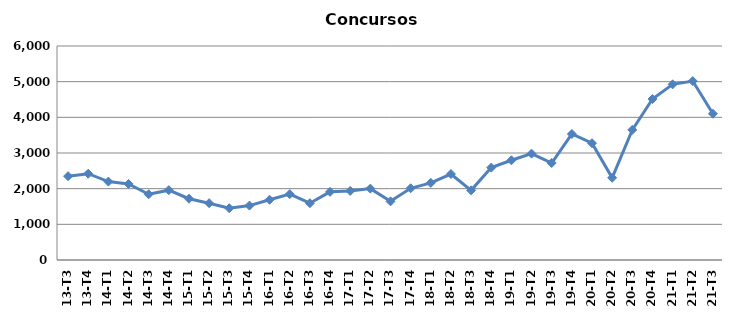
| Category | Concursos |
|---|---|
| 13-T3 | 2350 |
| 13-T4 | 2419 |
| 14-T1 | 2198 |
| 14-T2 | 2133 |
| 14-T3 | 1843 |
| 14-T4 | 1958 |
| 15-T1 | 1718 |
| 15-T2 | 1593 |
| 15-T3 | 1451 |
| 15-T4 | 1526 |
| 16-T1 | 1689 |
| 16-T2 | 1847 |
| 16-T3 | 1593 |
| 16-T4 | 1911 |
| 17-T1 | 1937 |
| 17-T2 | 2001 |
| 17-T3 | 1645 |
| 17-T4 | 2011 |
| 18-T1 | 2162 |
| 18-T2 | 2410 |
| 18-T3 | 1953 |
| 18-T4 | 2590 |
| 19-T1 | 2796 |
| 19-T2 | 2982 |
| 19-T3 | 2719 |
| 19-T4 | 3534 |
| 20-T1 | 3274 |
| 20-T2 | 2305 |
| 20-T3 | 3649 |
| 20-T4 | 4513 |
| 21-T1 | 4925 |
| 21-T2 | 5017 |
| 21-T3 | 4101 |